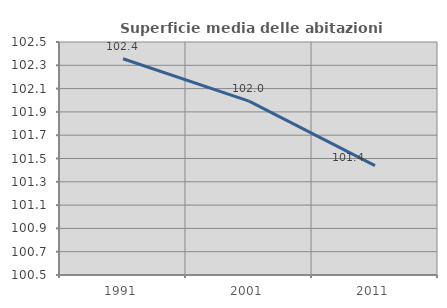
| Category | Superficie media delle abitazioni occupate |
|---|---|
| 1991.0 | 102.356 |
| 2001.0 | 101.993 |
| 2011.0 | 101.439 |